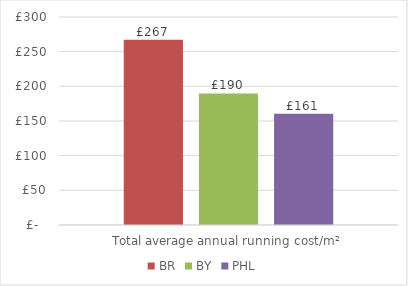
| Category | BR | BY | PHL |
|---|---|---|---|
| Total average annual running cost/m² | 267.339 | 189.745 | 160.607 |